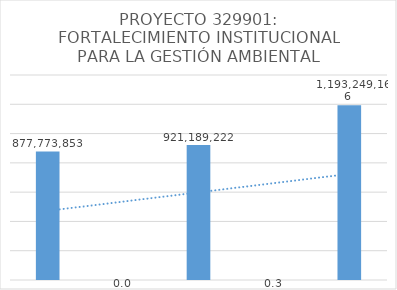
| Category | Series 0 |
|---|---|
| 0 | 877773853 |
| 1 | 0.049 |
| 2 | 921189221.76 |
| 3 | 0.295 |
| 4 | 1193249166.395 |